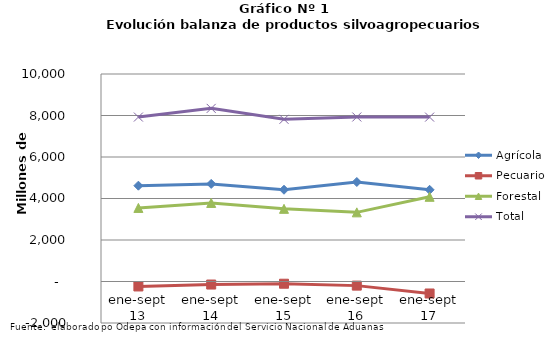
| Category | Agrícola | Pecuario | Forestal | Total |
|---|---|---|---|---|
| ene-sept 13 | 4617952 | -238773 | 3545669 | 7924848 |
| ene-sept 14 | 4703746 | -146807 | 3786414 | 8343353 |
| ene-sept 15 | 4422146 | -107215 | 3501852 | 7816783 |
| ene-sept 16 | 4794631 | -198708 | 3332485 | 7928408 |
| ene-sept 17 | 4419087 | -578056 | 4082022 | 7923053 |